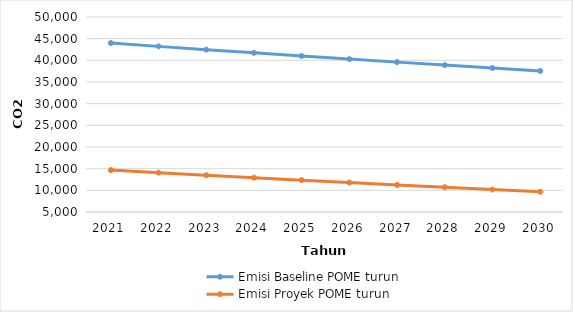
| Category | Emisi Baseline POME turun | Emisi Proyek POME turun |
|---|---|---|
| 2021.0 | 43988.054 | 14675.046 |
| 2022.0 | 43221.89 | 14078.593 |
| 2023.0 | 42469.071 | 13492.528 |
| 2024.0 | 41729.365 | 12916.671 |
| 2025.0 | 41002.542 | 12350.844 |
| 2026.0 | 40288.379 | 11794.872 |
| 2027.0 | 39586.654 | 11248.584 |
| 2028.0 | 38897.152 | 10711.811 |
| 2029.0 | 38219.66 | 10184.387 |
| 2030.0 | 37553.967 | 9666.149 |